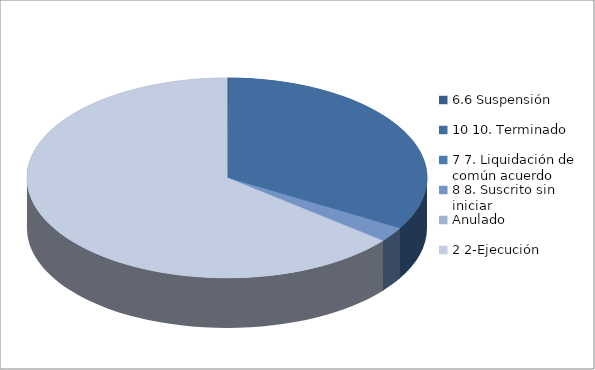
| Category | Series 0 |
|---|---|
| 6.6 Suspensión | 1 |
| 10 10. Terminado | 237 |
| 7 7. Liquidación de común acuerdo | 0 |
| 8 8. Suscrito sin iniciar | 17 |
| Anulado | 0 |
| 2 2-Ejecución | 457 |